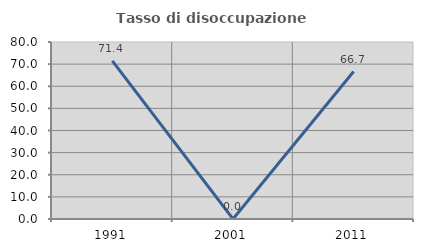
| Category | Tasso di disoccupazione giovanile  |
|---|---|
| 1991.0 | 71.429 |
| 2001.0 | 0 |
| 2011.0 | 66.667 |